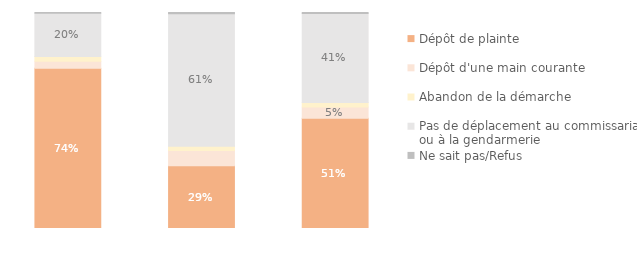
| Category | Dépôt de plainte | Dépôt d'une main courante | Abandon de la démarche | Pas de déplacement au commissariat ou à la gendarmerie | Ne sait pas/Refus |
|---|---|---|---|---|---|
| Ménages victimes d'un cambriolage | 0.741 | 0.033 | 0.022 | 0.2 | 0.003 |
| Ménages victimes d'une tentative | 0.29 | 0.071 | 0.02 | 0.613 | 0.006 |
| Ensemble des ménages victimes | 0.511 | 0.052 | 0.021 | 0.412 | 0.005 |